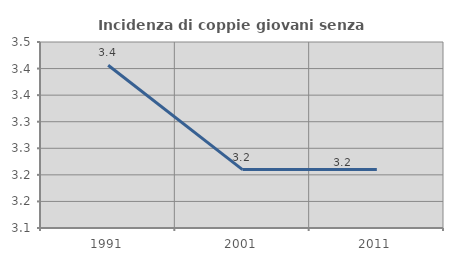
| Category | Incidenza di coppie giovani senza figli |
|---|---|
| 1991.0 | 3.406 |
| 2001.0 | 3.21 |
| 2011.0 | 3.21 |